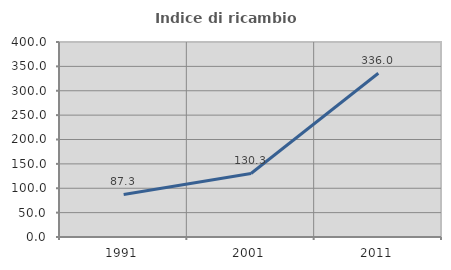
| Category | Indice di ricambio occupazionale  |
|---|---|
| 1991.0 | 87.293 |
| 2001.0 | 130.303 |
| 2011.0 | 336 |